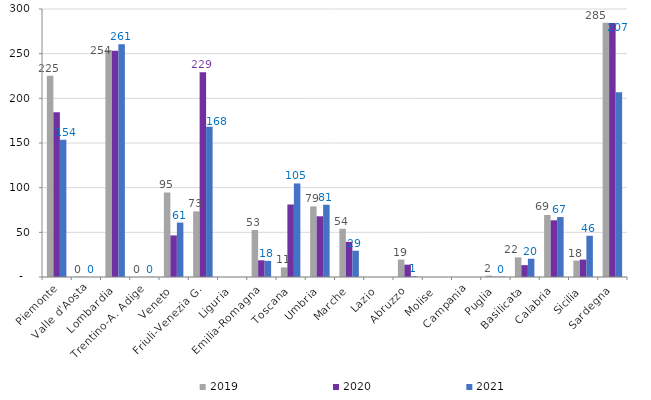
| Category | 2019 | 2020 | 2021 |
|---|---|---|---|
| Piemonte | 225.207 | 184.422 | 153.729 |
| Valle d'Aosta | 0.487 | 0.074 | 0.001 |
| Lombardia | 254.095 | 253.301 | 260.646 |
| Trentino-A. Adige | 0.002 | 0.003 | 0.238 |
| Veneto | 94.618 | 46.565 | 60.869 |
| Friuli-Venezia G. | 73.446 | 229.242 | 168.07 |
| Liguria | 0 | 0 | 0 |
| Emilia-Romagna | 52.628 | 18.681 | 18.036 |
| Toscana | 10.671 | 81.169 | 104.726 |
| Umbria | 79.042 | 67.952 | 80.854 |
| Marche | 53.992 | 39.364 | 29.428 |
| Lazio | 0 | 0 | 0 |
| Abruzzo | 19.482 | 13.822 | 0.814 |
| Molise | 0 | 0 | 0 |
| Campania | 0 | 0 | 0 |
| Puglia | 1.56 | 0.277 | 0.436 |
| Basilicata | 22.008 | 13.255 | 20.427 |
| Calabria | 69.425 | 63.479 | 67.106 |
| Sicilia | 18.346 | 19.475 | 46.121 |
| Sardegna | 284.736 | 284.294 | 206.844 |